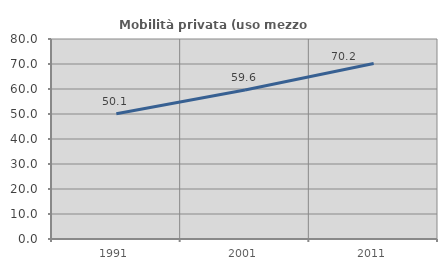
| Category | Mobilità privata (uso mezzo privato) |
|---|---|
| 1991.0 | 50.086 |
| 2001.0 | 59.636 |
| 2011.0 | 70.202 |